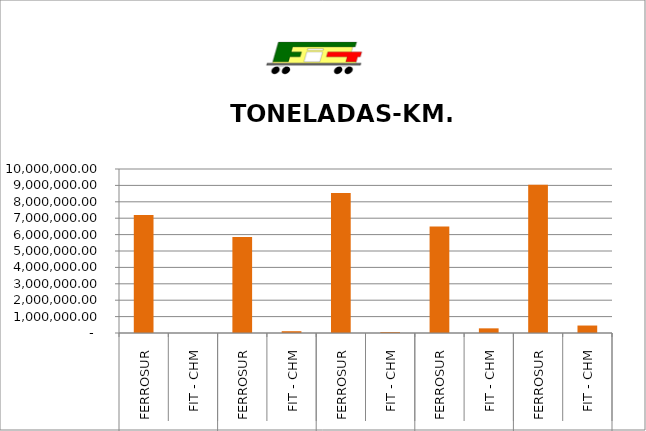
| Category | TONELADAS-KM. NETAS |
|---|---|
| 0 | 7197405 |
| 1 | 0 |
| 2 | 5856232.5 |
| 3 | 109620 |
| 4 | 8542725 |
| 5 | 54180 |
| 6 | 6498932.5 |
| 7 | 283840 |
| 8 | 9046712.5 |
| 9 | 455422.5 |